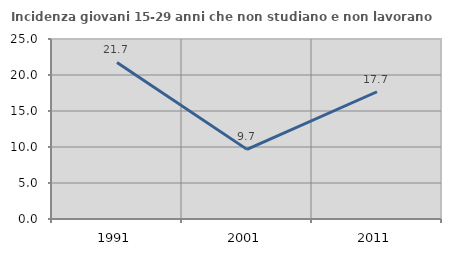
| Category | Incidenza giovani 15-29 anni che non studiano e non lavorano  |
|---|---|
| 1991.0 | 21.739 |
| 2001.0 | 9.67 |
| 2011.0 | 17.674 |